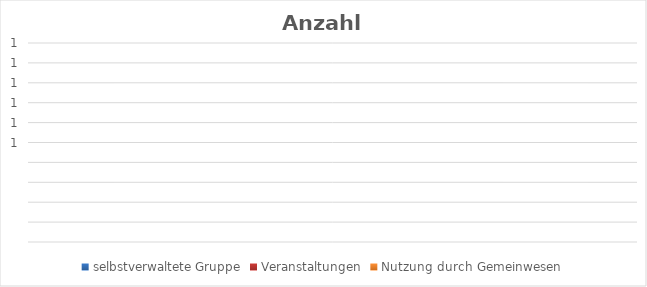
| Category | selbstverwaltete Gruppe | Veranstaltungen | Nutzung durch Gemeinwesen |
|---|---|---|---|
| 0 | 0 | 0 | 0 |